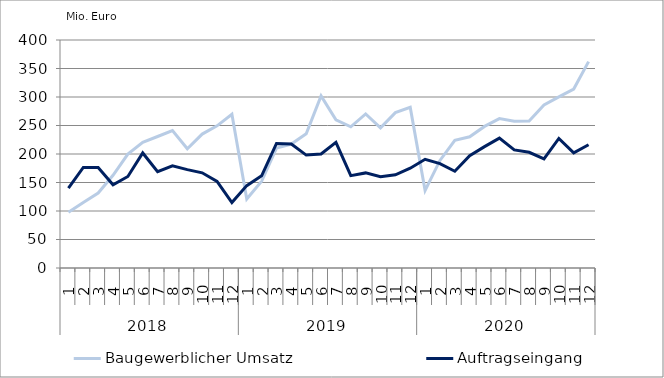
| Category | Baugewerblicher Umsatz | Auftragseingang |
|---|---|---|
| 0 | 97959.056 | 140119.385 |
| 1 | 114756.787 | 176330.213 |
| 2 | 131454.642 | 176241.061 |
| 3 | 162648.053 | 146063.407 |
| 4 | 199809.407 | 160551.931 |
| 5 | 220535.974 | 201835.846 |
| 6 | 230672.472 | 169132.23 |
| 7 | 241233.619 | 179396.293 |
| 8 | 209099.292 | 172542.764 |
| 9 | 234953.007 | 166991.729 |
| 10 | 249410.043 | 151835.629 |
| 11 | 269773.227 | 114807.456 |
| 12 | 120975.133 | 144510.881 |
| 13 | 152329.786 | 161685.201 |
| 14 | 210227.67 | 218455.879 |
| 15 | 217522.321 | 217610.064 |
| 16 | 235490.429 | 198110.439 |
| 17 | 301963.302 | 200012.086 |
| 18 | 259975.317 | 220559.061 |
| 19 | 247779.658 | 162059.723 |
| 20 | 270249.609 | 166829.611 |
| 21 | 245966.91 | 160120.773 |
| 22 | 272620.351 | 163589.389 |
| 23 | 281810.121 | 175051.247 |
| 24 | 136135.432 | 190647.086 |
| 25 | 188682.361 | 183141.14 |
| 26 | 224009.315 | 169770.009 |
| 27 | 230172.252 | 196979.845 |
| 28 | 248410.714 | 212955.83 |
| 29 | 262078.128 | 227853.487 |
| 30 | 257360.37 | 207209.188 |
| 31 | 257932.168 | 202976.091 |
| 32 | 285866.269 | 191463.844 |
| 33 | 300164.57 | 227245.467 |
| 34 | 313922.518 | 202060.636 |
| 35 | 362040.738 | 216296.504 |